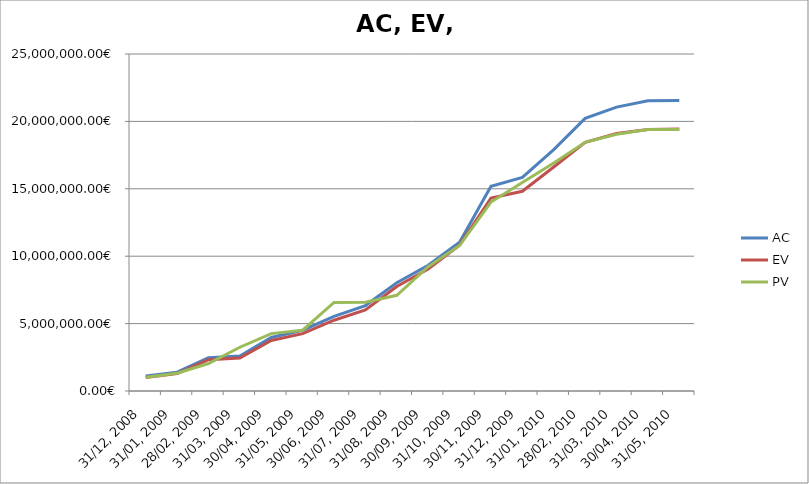
| Category | AC | EV | PV |
|---|---|---|---|
| 31/12, 2008 | 1111851.084 | 1009398.658 | 1018793.398 |
| 31/01, 2009 | 1395731.63 | 1289942.414 | 1316121.084 |
| 28/02, 2009 | 2475149.162 | 2325429.167 | 2036449.355 |
| 31/03, 2009 | 2594640.311 | 2442850.227 | 3246082.164 |
| 30/04, 2009 | 3973669.015 | 3751388.57 | 4256694.977 |
| 31/05, 2009 | 4507093.921 | 4256694.977 | 4509348.18 |
| 30/06, 2009 | 5539355.039 | 5249586.134 | 6572151.367 |
| 31/07, 2009 | 6339492.398 | 6007545.743 | 6592631.797 |
| 31/08, 2009 | 8029808.338 | 7753530.192 | 7099992.173 |
| 30/09, 2009 | 9332823.373 | 9042881.536 | 9218188.22 |
| 31/10, 2009 | 11044440.211 | 10822831.613 | 10793119.919 |
| 30/11, 2009 | 15184272.317 | 14317301.681 | 14017136.343 |
| 31/12, 2009 | 15851825.611 | 14816939.098 | 15474629.046 |
| 31/01, 2010 | 17911569.371 | 16614471.162 | 16907759.006 |
| 28/02, 2010 | 20222835.016 | 18442142.188 | 18451257.599 |
| 31/03, 2010 | 21060797.024 | 19100448.715 | 19049541.665 |
| 30/04, 2010 | 21524152.052 | 19407310.513 | 19396000.744 |
| 31/05, 2010 | 21546846.182 | 19429810.513 | 19407310.513 |